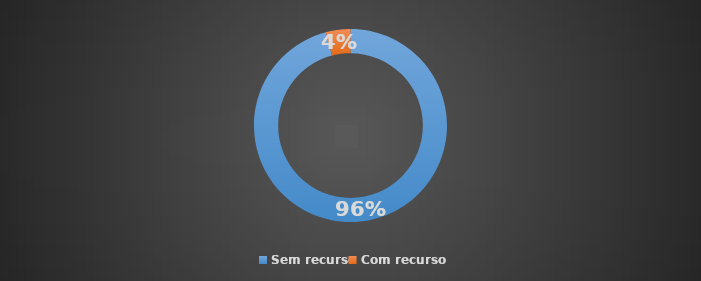
| Category | Total |
|---|---|
| Sem recurso | 0.959 |
| Com recurso | 0.041 |